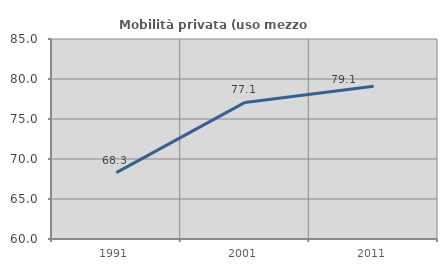
| Category | Mobilità privata (uso mezzo privato) |
|---|---|
| 1991.0 | 68.303 |
| 2001.0 | 77.073 |
| 2011.0 | 79.106 |